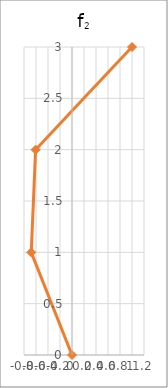
| Category | f2 |
|---|---|
| 0.0 | 0 |
| -0.6789774751144153 | 1 |
| -0.6065990924638335 | 2 |
| 1.0 | 3 |